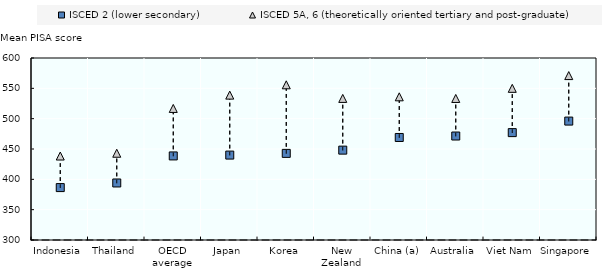
| Category | ISCED 2 (lower secondary) | ISCED 5A, 6 (theoretically oriented tertiary and post-graduate) |
|---|---|---|
| Indonesia | 386.402 | 438.414 |
| Thailand | 394 | 443 |
| OECD average | 438.582 | 516.848 |
| Japan | 439.964 | 538.825 |
| Korea | 442.778 | 555.826 |
| New Zealand | 448.132 | 533.378 |
| China (a) | 469 | 536 |
| Australia | 471.395 | 533.314 |
| Viet Nam | 477 | 550 |
| Singapore | 496 | 571 |